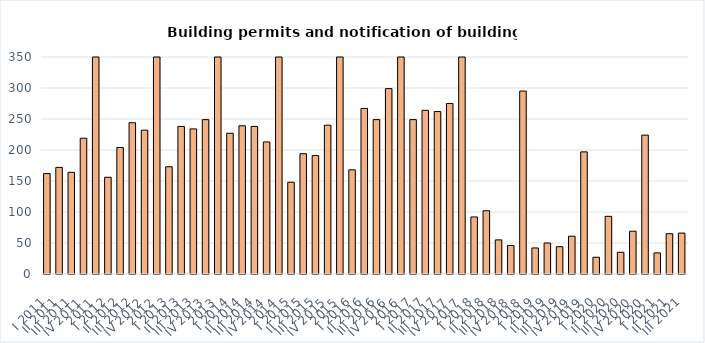
| Category | Building permits and notification of building work |
|---|---|
| I 2011 | 162 |
| II 2011 | 172 |
| III 2011 | 164 |
| IV 2011 | 219 |
| 2011 | 717 |
| I 2012 | 156 |
| II 2012 | 204 |
| III 2012 | 244 |
| IV 2012 | 232 |
| 2012 | 836 |
| I 2013 | 173 |
| II 2013 | 238 |
| III 2013 | 234 |
| IV 2013 | 249 |
| 2013 | 894 |
| I 2014 | 227 |
| II 2014 | 239 |
| III 2014 | 238 |
| IV 2014 | 213 |
| 2014 | 917 |
| I 2015 | 148 |
| II 2015 | 194 |
| III 2015 | 191 |
| IV 2015 | 240 |
| 2015 | 773 |
| I 2016 | 168 |
| II 2016 | 267 |
| III 2016 | 249 |
| IV 2016 | 299 |
| 2016 | 983 |
| I 2017 | 249 |
| II 2017 | 264 |
| III 2017 | 262 |
| IV 2017 | 275 |
| 2017 | 1050 |
| I 2018 | 92 |
| II 2018 | 102 |
| III 2018 | 55 |
| IV 2018 | 46 |
| 2018 | 295 |
| I 2019 | 42 |
| II 2019 | 50 |
| III 2019 | 44 |
| IV 2019 | 61 |
| 2019 | 197 |
| I 2020 | 27 |
| II 2020 | 93 |
| III 2020 | 35 |
| IV 2020 | 69 |
| 2020 | 224 |
| I 2021 | 34 |
| II 2021 | 65 |
| III 2021 | 66 |